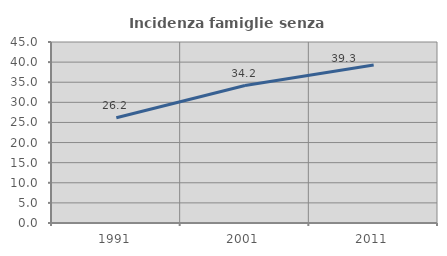
| Category | Incidenza famiglie senza nuclei |
|---|---|
| 1991.0 | 26.151 |
| 2001.0 | 34.169 |
| 2011.0 | 39.276 |